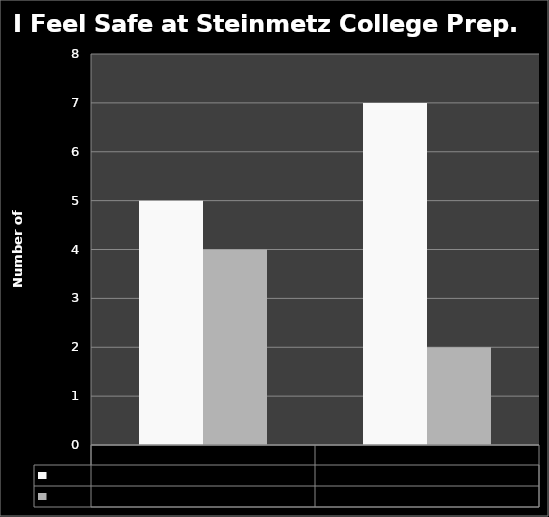
| Category | TRUE | FALSE |
|---|---|---|
| Pre | 5 | 4 |
| Post | 7 | 2 |